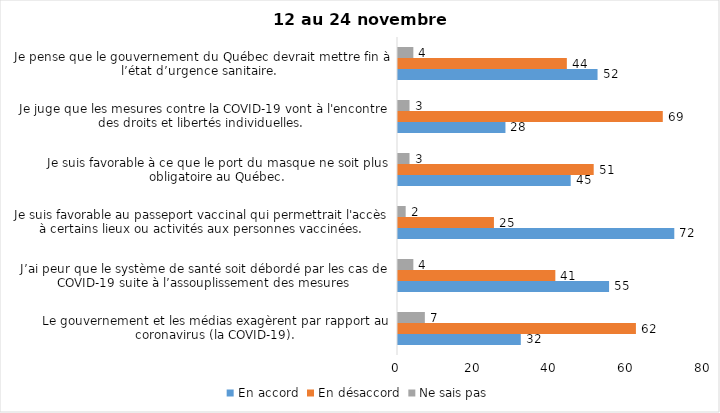
| Category | En accord | En désaccord | Ne sais pas |
|---|---|---|---|
| Le gouvernement et les médias exagèrent par rapport au coronavirus (la COVID-19). | 32 | 62 | 7 |
| J’ai peur que le système de santé soit débordé par les cas de COVID-19 suite à l’assouplissement des mesures | 55 | 41 | 4 |
| Je suis favorable au passeport vaccinal qui permettrait l'accès à certains lieux ou activités aux personnes vaccinées. | 72 | 25 | 2 |
| Je suis favorable à ce que le port du masque ne soit plus obligatoire au Québec. | 45 | 51 | 3 |
| Je juge que les mesures contre la COVID-19 vont à l'encontre des droits et libertés individuelles.  | 28 | 69 | 3 |
| Je pense que le gouvernement du Québec devrait mettre fin à l’état d’urgence sanitaire.  | 52 | 44 | 4 |